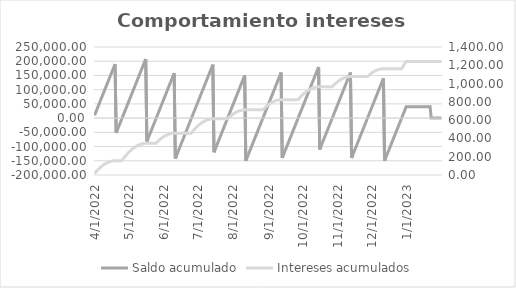
| Category | Saldo acumulado |
|---|---|
| 4/1/22 | 10000 |
| 4/2/22 | 20000 |
| 4/3/22 | 30000 |
| 4/4/22 | 40000 |
| 4/5/22 | 50000 |
| 4/6/22 | 60000 |
| 4/7/22 | 70000 |
| 4/8/22 | 80000 |
| 4/9/22 | 90000 |
| 4/10/22 | 100000 |
| 4/11/22 | 110000 |
| 4/12/22 | 120000 |
| 4/13/22 | 130000 |
| 4/14/22 | 140000 |
| 4/15/22 | 150000 |
| 4/16/22 | 160000 |
| 4/17/22 | 170000 |
| 4/18/22 | 180000 |
| 4/19/22 | 190000 |
| 4/20/22 | -52000 |
| 4/21/22 | -42000 |
| 4/22/22 | -32000 |
| 4/23/22 | -22000 |
| 4/24/22 | -12000 |
| 4/25/22 | -2000 |
| 4/26/22 | 8000 |
| 4/27/22 | 18000 |
| 4/28/22 | 28000 |
| 4/29/22 | 38000 |
| 4/30/22 | 48000 |
| 5/1/22 | 58000 |
| 5/2/22 | 68000 |
| 5/3/22 | 78000 |
| 5/4/22 | 88000 |
| 5/5/22 | 98000 |
| 5/6/22 | 108000 |
| 5/7/22 | 118000 |
| 5/8/22 | 128000 |
| 5/9/22 | 138000 |
| 5/10/22 | 148000 |
| 5/11/22 | 158000 |
| 5/12/22 | 168000 |
| 5/13/22 | 178000 |
| 5/14/22 | 188000 |
| 5/15/22 | 198000 |
| 5/16/22 | 208000 |
| 5/17/22 | -82000 |
| 5/18/22 | -72000 |
| 5/19/22 | -62000 |
| 5/20/22 | -52000 |
| 5/21/22 | -42000 |
| 5/22/22 | -32000 |
| 5/23/22 | -22000 |
| 5/24/22 | -12000 |
| 5/25/22 | -2000 |
| 5/26/22 | 8000 |
| 5/27/22 | 18000 |
| 5/28/22 | 28000 |
| 5/29/22 | 38000 |
| 5/30/22 | 48000 |
| 5/31/22 | 58000 |
| 6/1/22 | 68000 |
| 6/2/22 | 78000 |
| 6/3/22 | 88000 |
| 6/4/22 | 98000 |
| 6/5/22 | 108000 |
| 6/6/22 | 118000 |
| 6/7/22 | 128000 |
| 6/8/22 | 138000 |
| 6/9/22 | 148000 |
| 6/10/22 | 158000 |
| 6/11/22 | -142000 |
| 6/12/22 | -132000 |
| 6/13/22 | -122000 |
| 6/14/22 | -112000 |
| 6/15/22 | -102000 |
| 6/16/22 | -92000 |
| 6/17/22 | -82000 |
| 6/18/22 | -72000 |
| 6/19/22 | -62000 |
| 6/20/22 | -52000 |
| 6/21/22 | -42000 |
| 6/22/22 | -32000 |
| 6/23/22 | -22000 |
| 6/24/22 | -12000 |
| 6/25/22 | -2000 |
| 6/26/22 | 8000 |
| 6/27/22 | 18000 |
| 6/28/22 | 28000 |
| 6/29/22 | 38000 |
| 6/30/22 | 48000 |
| 7/1/22 | 58000 |
| 7/2/22 | 68000 |
| 7/3/22 | 78000 |
| 7/4/22 | 88000 |
| 7/5/22 | 98000 |
| 7/6/22 | 108000 |
| 7/7/22 | 118000 |
| 7/8/22 | 128000 |
| 7/9/22 | 138000 |
| 7/10/22 | 148000 |
| 7/11/22 | 158000 |
| 7/12/22 | 168000 |
| 7/13/22 | 178000 |
| 7/14/22 | 188000 |
| 7/15/22 | -120000 |
| 7/16/22 | -110000 |
| 7/17/22 | -100000 |
| 7/18/22 | -90000 |
| 7/19/22 | -80000 |
| 7/20/22 | -70000 |
| 7/21/22 | -60000 |
| 7/22/22 | -50000 |
| 7/23/22 | -40000 |
| 7/24/22 | -30000 |
| 7/25/22 | -20000 |
| 7/26/22 | -10000 |
| 7/27/22 | 0 |
| 7/28/22 | 10000 |
| 7/29/22 | 20000 |
| 7/30/22 | 30000 |
| 7/31/22 | 40000 |
| 8/1/22 | 50000 |
| 8/2/22 | 60000 |
| 8/3/22 | 70000 |
| 8/4/22 | 80000 |
| 8/5/22 | 90000 |
| 8/6/22 | 100000 |
| 8/7/22 | 110000 |
| 8/8/22 | 120000 |
| 8/9/22 | 130000 |
| 8/10/22 | 140000 |
| 8/11/22 | 150000 |
| 8/12/22 | -150000 |
| 8/13/22 | -140000 |
| 8/14/22 | -130000 |
| 8/15/22 | -120000 |
| 8/16/22 | -110000 |
| 8/17/22 | -100000 |
| 8/18/22 | -90000 |
| 8/19/22 | -80000 |
| 8/20/22 | -70000 |
| 8/21/22 | -60000 |
| 8/22/22 | -50000 |
| 8/23/22 | -40000 |
| 8/24/22 | -30000 |
| 8/25/22 | -20000 |
| 8/26/22 | -10000 |
| 8/27/22 | 0 |
| 8/28/22 | 10000 |
| 8/29/22 | 20000 |
| 8/30/22 | 30000 |
| 8/31/22 | 40000 |
| 9/1/22 | 50000 |
| 9/2/22 | 60000 |
| 9/3/22 | 70000 |
| 9/4/22 | 80000 |
| 9/5/22 | 90000 |
| 9/6/22 | 100000 |
| 9/7/22 | 110000 |
| 9/8/22 | 120000 |
| 9/9/22 | 130000 |
| 9/10/22 | 140000 |
| 9/11/22 | 150000 |
| 9/12/22 | 160000 |
| 9/13/22 | -140000 |
| 9/14/22 | -130000 |
| 9/15/22 | -120000 |
| 9/16/22 | -110000 |
| 9/17/22 | -100000 |
| 9/18/22 | -90000 |
| 9/19/22 | -80000 |
| 9/20/22 | -70000 |
| 9/21/22 | -60000 |
| 9/22/22 | -50000 |
| 9/23/22 | -40000 |
| 9/24/22 | -30000 |
| 9/25/22 | -20000 |
| 9/26/22 | -10000 |
| 9/27/22 | 0 |
| 9/28/22 | 10000 |
| 9/29/22 | 20000 |
| 9/30/22 | 30000 |
| 10/1/22 | 40000 |
| 10/2/22 | 50000 |
| 10/3/22 | 60000 |
| 10/4/22 | 70000 |
| 10/5/22 | 80000 |
| 10/6/22 | 90000 |
| 10/7/22 | 100000 |
| 10/8/22 | 110000 |
| 10/9/22 | 120000 |
| 10/10/22 | 130000 |
| 10/11/22 | 140000 |
| 10/12/22 | 150000 |
| 10/13/22 | 160000 |
| 10/14/22 | 170000 |
| 10/15/22 | 180000 |
| 10/16/22 | -110000 |
| 10/17/22 | -100000 |
| 10/18/22 | -90000 |
| 10/19/22 | -80000 |
| 10/20/22 | -70000 |
| 10/21/22 | -60000 |
| 10/22/22 | -50000 |
| 10/23/22 | -40000 |
| 10/24/22 | -30000 |
| 10/25/22 | -20000 |
| 10/26/22 | -10000 |
| 10/27/22 | 0 |
| 10/28/22 | 10000 |
| 10/29/22 | 20000 |
| 10/30/22 | 30000 |
| 10/31/22 | 40000 |
| 11/1/22 | 50000 |
| 11/2/22 | 60000 |
| 11/3/22 | 70000 |
| 11/4/22 | 80000 |
| 11/5/22 | 90000 |
| 11/6/22 | 100000 |
| 11/7/22 | 110000 |
| 11/8/22 | 120000 |
| 11/9/22 | 130000 |
| 11/10/22 | 140000 |
| 11/11/22 | 150000 |
| 11/12/22 | 160000 |
| 11/13/22 | -140000 |
| 11/14/22 | -130000 |
| 11/15/22 | -120000 |
| 11/16/22 | -110000 |
| 11/17/22 | -100000 |
| 11/18/22 | -90000 |
| 11/19/22 | -80000 |
| 11/20/22 | -70000 |
| 11/21/22 | -60000 |
| 11/22/22 | -50000 |
| 11/23/22 | -40000 |
| 11/24/22 | -30000 |
| 11/25/22 | -20000 |
| 11/26/22 | -10000 |
| 11/27/22 | 0 |
| 11/28/22 | 10000 |
| 11/29/22 | 20000 |
| 11/30/22 | 30000 |
| 12/1/22 | 40000 |
| 12/2/22 | 50000 |
| 12/3/22 | 60000 |
| 12/4/22 | 70000 |
| 12/5/22 | 80000 |
| 12/6/22 | 90000 |
| 12/7/22 | 100000 |
| 12/8/22 | 110000 |
| 12/9/22 | 120000 |
| 12/10/22 | 130000 |
| 12/11/22 | 140000 |
| 12/12/22 | -150000 |
| 12/13/22 | -140000 |
| 12/14/22 | -130000 |
| 12/15/22 | -120000 |
| 12/16/22 | -110000 |
| 12/17/22 | -100000 |
| 12/18/22 | -90000 |
| 12/19/22 | -80000 |
| 12/20/22 | -70000 |
| 12/21/22 | -60000 |
| 12/22/22 | -50000 |
| 12/23/22 | -40000 |
| 12/24/22 | -30000 |
| 12/25/22 | -20000 |
| 12/26/22 | -10000 |
| 12/27/22 | 0 |
| 12/28/22 | 10000 |
| 12/29/22 | 20000 |
| 12/30/22 | 30000 |
| 12/31/22 | 40000 |
| 1/1/23 | 40000 |
| 1/2/23 | 40000 |
| 1/3/23 | 40000 |
| 1/4/23 | 40000 |
| 1/5/23 | 40000 |
| 1/6/23 | 40000 |
| 1/7/23 | 40000 |
| 1/8/23 | 40000 |
| 1/9/23 | 40000 |
| 1/10/23 | 40000 |
| 1/11/23 | 40000 |
| 1/12/23 | 40000 |
| 1/13/23 | 40000 |
| 1/14/23 | 40000 |
| 1/15/23 | 40000 |
| 1/16/23 | 40000 |
| 1/17/23 | 40000 |
| 1/18/23 | 40000 |
| 1/19/23 | 40000 |
| 1/20/23 | 40000 |
| 1/21/23 | 40000 |
| 1/22/23 | 0 |
| 1/23/23 | 0 |
| 1/24/23 | 0 |
| 1/25/23 | 0 |
| 1/26/23 | 0 |
| 1/27/23 | 0 |
| 1/28/23 | 0 |
| 1/29/23 | 0 |
| 1/30/23 | 0 |
| 1/31/23 | 0 |